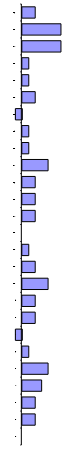
| Category | Series 0 |
|---|---|
| 0 | 0 |
| 1 | 0.069 |
| 2 | 0.069 |
| 3 | 0.103 |
| 4 | 0.138 |
| 5 | 0.034 |
| 6 | -0.034 |
| 7 | 0.069 |
| 8 | 0.069 |
| 9 | 0.138 |
| 10 | 0.069 |
| 11 | 0.034 |
| 12 | 0 |
| 13 | 0.069 |
| 14 | 0.069 |
| 15 | 0.069 |
| 16 | 0.138 |
| 17 | 0.034 |
| 18 | 0.034 |
| 19 | -0.034 |
| 20 | 0.069 |
| 21 | 0.034 |
| 22 | 0.034 |
| 23 | 0.207 |
| 24 | 0.207 |
| 25 | 0.069 |